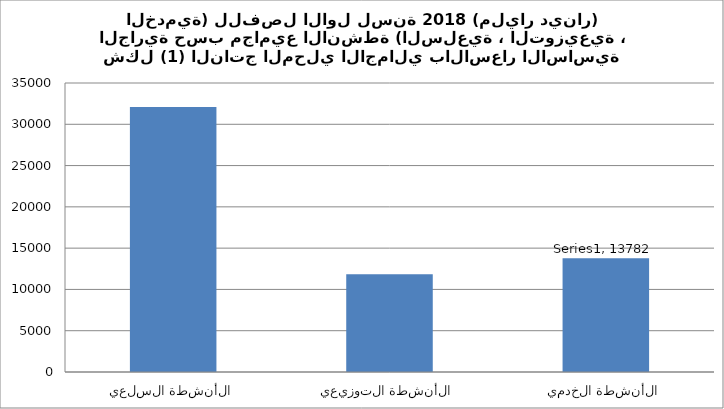
| Category | Series 0 |
|---|---|
| الأنشطة السلعية | 32088.31 |
| الأنشطة التوزيعية | 11832.867 |
| الأنشطة الخدمية | 13782.421 |